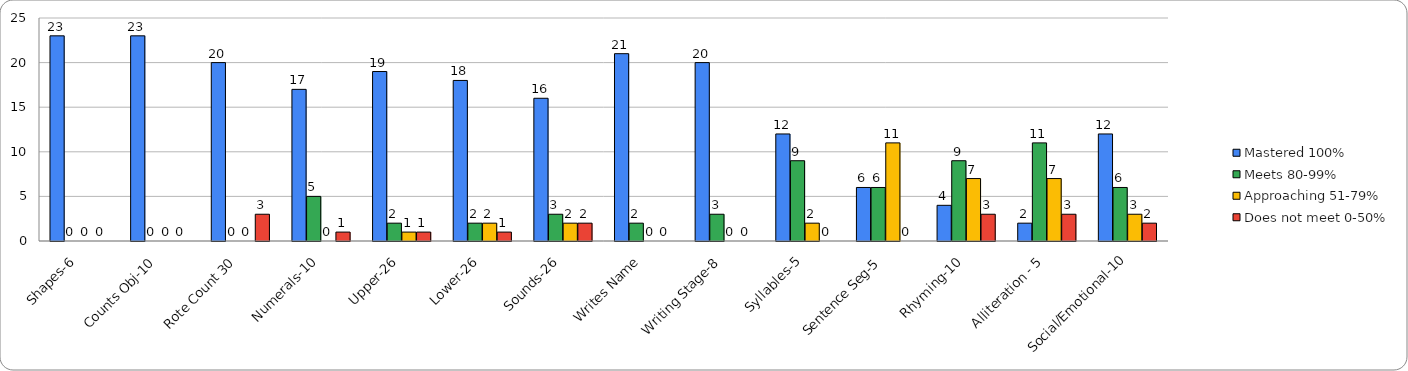
| Category | Mastered 100% | Meets 80-99% | Approaching 51-79% | Does not meet 0-50% |
|---|---|---|---|---|
| Shapes-6 | 23 | 0 | 0 | 0 |
| Counts Obj-10 | 23 | 0 | 0 | 0 |
| Rote Count 30 | 20 | 0 | 0 | 3 |
| Numerals-10 | 17 | 5 | 0 | 1 |
| Upper-26 | 19 | 2 | 1 | 1 |
| Lower-26 | 18 | 2 | 2 | 1 |
| Sounds-26 | 16 | 3 | 2 | 2 |
| Writes Name | 21 | 2 | 0 | 0 |
| Writing Stage-8 | 20 | 3 | 0 | 0 |
| Syllables-5 | 12 | 9 | 2 | 0 |
| Sentence Seg-5 | 6 | 6 | 11 | 0 |
| Rhyming-10 | 4 | 9 | 7 | 3 |
| Alliteration - 5 | 2 | 11 | 7 | 3 |
| Social/Emotional-10 | 12 | 6 | 3 | 2 |